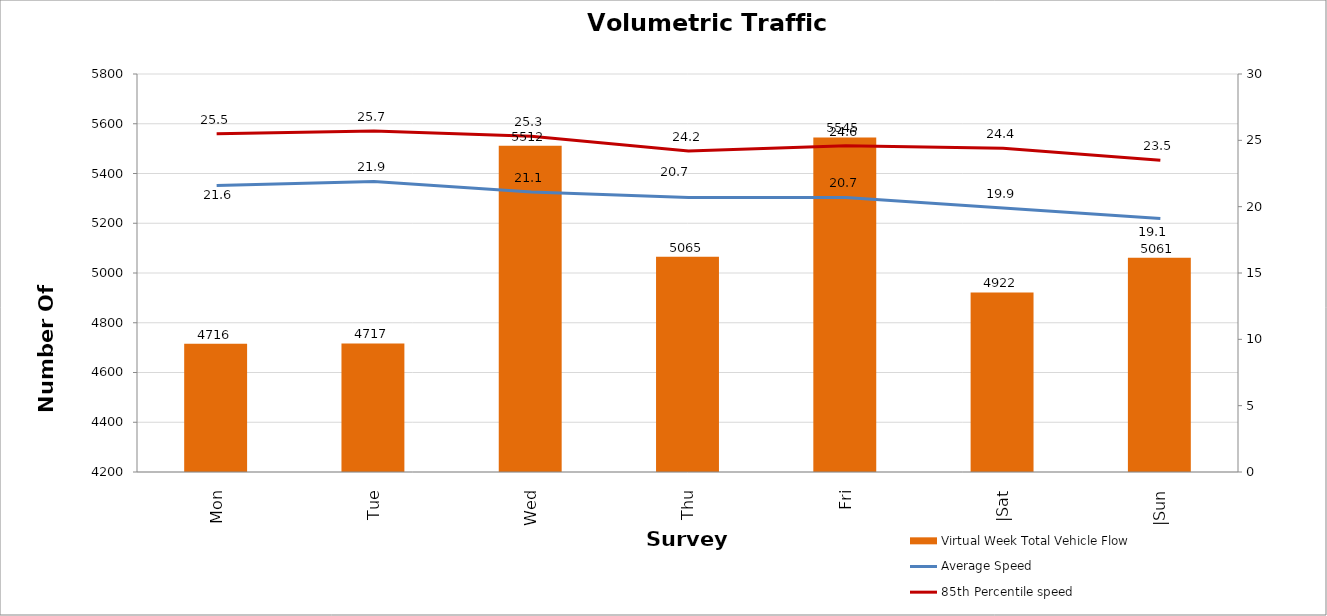
| Category | Virtual Week Total Vehicle Flow |
|---|---|
| Mon | 4716 |
| Tue | 4717 |
| Wed | 5512 |
| Thu | 5065 |
| Fri | 5545 |
| |Sat | 4922 |
| |Sun | 5061 |